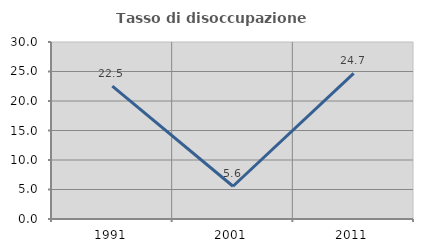
| Category | Tasso di disoccupazione giovanile  |
|---|---|
| 1991.0 | 22.517 |
| 2001.0 | 5.556 |
| 2011.0 | 24.691 |